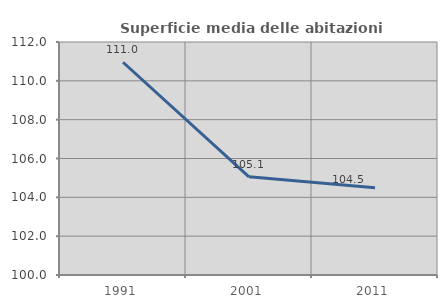
| Category | Superficie media delle abitazioni occupate |
|---|---|
| 1991.0 | 110.958 |
| 2001.0 | 105.058 |
| 2011.0 | 104.493 |